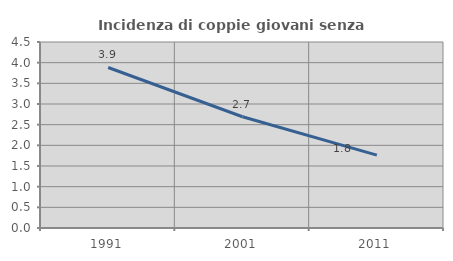
| Category | Incidenza di coppie giovani senza figli |
|---|---|
| 1991.0 | 3.883 |
| 2001.0 | 2.692 |
| 2011.0 | 1.762 |